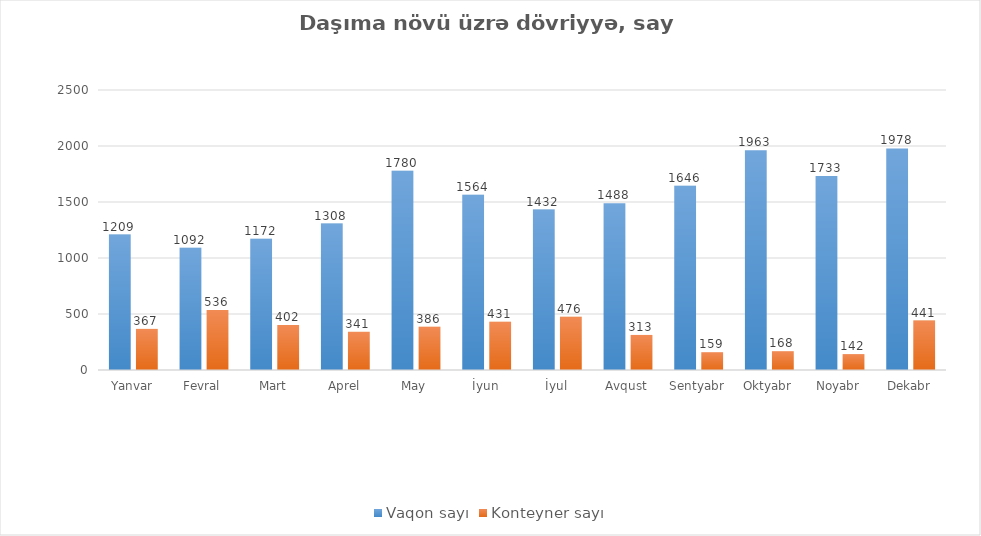
| Category | Vaqon sayı | Konteyner sayı |
|---|---|---|
| Yanvar | 1209 | 367 |
| Fevral | 1092 | 536 |
| Mart | 1172 | 402 |
| Aprel | 1308 | 341 |
| May | 1780 | 386 |
| İyun | 1564 | 431 |
| İyul | 1432 | 476 |
| Avqust | 1488 | 313 |
| Sentyabr | 1646 | 159 |
| Oktyabr | 1963 | 168 |
| Noyabr | 1733 | 142 |
| Dekabr | 1978 | 441 |